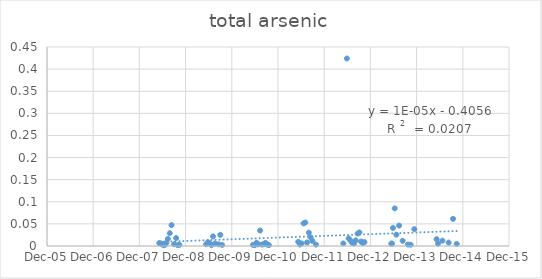
| Category | Series 0 |
|---|---|
| 39577.0 | 0.007 |
| 39590.0 | 0.005 |
| 39604.0 | 0.003 |
| 39618.0 | 0.002 |
| 39633.0 | 0.007 |
| 39645.0 | 0.016 |
| 39660.0 | 0.029 |
| 39674.0 | 0.047 |
| 39695.0 | 0.004 |
| 39710.0 | 0.018 |
| 39723.0 | 0.002 |
| 39736.0 | 0.003 |
| 39947.0 | 0.004 |
| 39961.0 | 0.009 |
| 39974.0 | 0.006 |
| 39989.0 | 0.002 |
| 40002.0 | 0.022 |
| 40017.0 | 0.006 |
| 40045.0 | 0.004 |
| 40059.0 | 0.025 |
| 40073.0 | 0.002 |
| 40317.0 | 0.003 |
| 40332.0 | 0.002 |
| 40346.0 | 0.007 |
| 40359.0 | 0.004 |
| 40374.0 | 0.035 |
| 40388.0 | 0.003 |
| 40402.0 | 0.004 |
| 40415.0 | 0.007 |
| 40429.0 | 0.003 |
| 40443.0 | 0.002 |
| 40675.0 | 0.009 |
| 40689.0 | 0.003 |
| 40702.0 | 0.006 |
| 40717.0 | 0.051 |
| 40731.0 | 0.053 |
| 40745.0 | 0.008 |
| 40759.0 | 0.03 |
| 40773.0 | 0.019 |
| 40787.0 | 0.011 |
| 40815.0 | 0.003 |
| 41031.0 | 0.006 |
| 41059.0 | 0.424 |
| 41073.0 | 0.017 |
| 41087.0 | 0.013 |
| 41101.0 | 0.007 |
| 41115.0 | 0.006 |
| 41129.0 | 0.013 |
| 41144.0 | 0.028 |
| 41158.0 | 0.031 |
| 41171.0 | 0.01 |
| 41186.0 | 0.007 |
| 41198.0 | 0.009 |
| 41410.0 | 0.005 |
| 41416.0 | 0.005 |
| 41423.0 | 0.041 |
| 41437.0 | 0.085 |
| 41450.0 | 0.026 |
| 41472.0 | 0.046 |
| 41500.0 | 0.012 |
| 41541.0 | 0.003 |
| 41563.0 | 0.003 |
| 41592.0 | 0.038 |
| 41768.0 | 0.016 |
| 41780.0 | 0.005 |
| 41814.0 | 0.012 |
| 41863.0 | 0.008 |
| 41898.0 | 0.061 |
| 41927.0 | 0.005 |